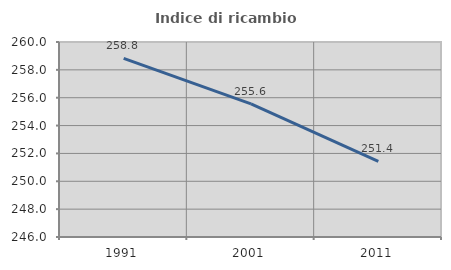
| Category | Indice di ricambio occupazionale  |
|---|---|
| 1991.0 | 258.824 |
| 2001.0 | 255.556 |
| 2011.0 | 251.429 |